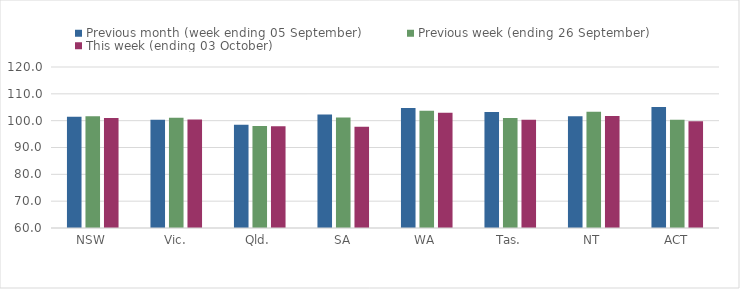
| Category | Previous month (week ending 05 September) | Previous week (ending 26 September) | This week (ending 03 October) |
|---|---|---|---|
| NSW | 101.46 | 101.68 | 101.04 |
| Vic. | 100.31 | 101.13 | 100.42 |
| Qld. | 98.48 | 98.01 | 97.91 |
| SA | 102.29 | 101.19 | 97.77 |
| WA | 104.7 | 103.66 | 102.92 |
| Tas. | 103.27 | 101 | 100.36 |
| NT | 101.61 | 103.28 | 101.75 |
| ACT | 105.11 | 100.34 | 99.8 |